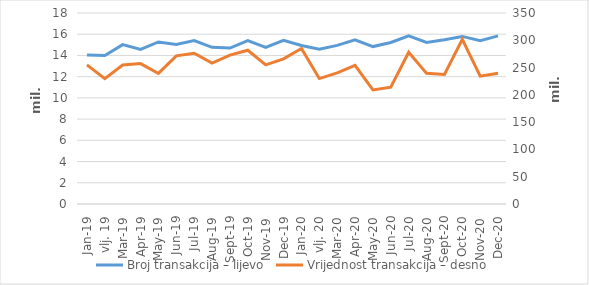
| Category | Broj transakcija – lijevo |
|---|---|
| sij.19 | 14051758 |
| vlj. 19 | 13993705 |
| ožu.19 | 15018362 |
| tra.19 | 14573386 |
| svi.19 | 15274233 |
| lip.19 | 15041226 |
| srp.19 | 15403097 |
| kol.19 | 14762747 |
| ruj.19 | 14697605 |
| lis.19 | 15394413 |
| stu.19 | 14755458 |
| pro.19 | 15431812 |
| sij.20 | 14934534 |
| vlj. 20 | 14581295 |
| ožu.20 | 14949924 |
| tra.20 | 15475047 |
| svi.20 | 14836361 |
| lip.20 | 15221341 |
| srp.20 | 15852587 |
| kol.20 | 15230743 |
| ruj.20 | 15480174 |
| lis.20 | 15793838 |
| stu.20 | 15391839 |
| pro.20 | 15841467 |